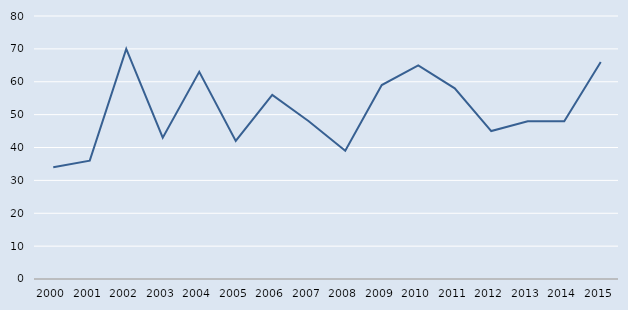
| Category | Series 0 |
|---|---|
| 2000.0 | 34 |
| 2001.0 | 36 |
| 2002.0 | 70 |
| 2003.0 | 43 |
| 2004.0 | 63 |
| 2005.0 | 42 |
| 2006.0 | 56 |
| 2007.0 | 48 |
| 2008.0 | 39 |
| 2009.0 | 59 |
| 2010.0 | 65 |
| 2011.0 | 58 |
| 2012.0 | 45 |
| 2013.0 | 48 |
| 2014.0 | 48 |
| 2015.0 | 66 |